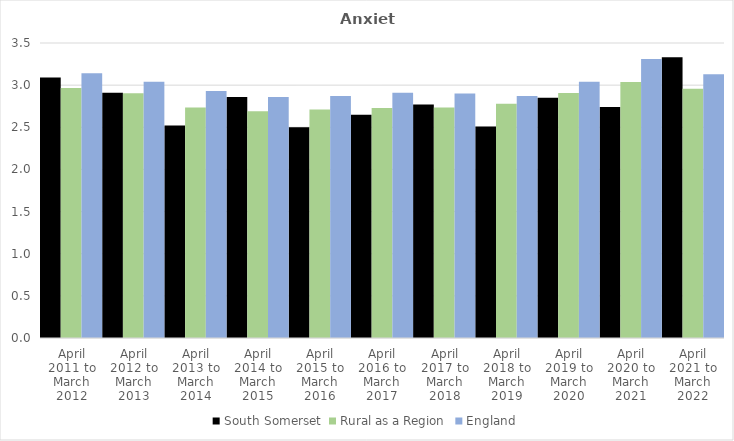
| Category | South Somerset | Rural as a Region | England |
|---|---|---|---|
| April 2011 to March 2012 | 3.09 | 2.967 | 3.14 |
| April 2012 to March 2013 | 2.91 | 2.904 | 3.04 |
| April 2013 to March 2014 | 2.52 | 2.734 | 2.93 |
| April 2014 to March 2015 | 2.86 | 2.691 | 2.86 |
| April 2015 to March 2016 | 2.5 | 2.711 | 2.87 |
| April 2016 to March 2017 | 2.65 | 2.729 | 2.91 |
| April 2017 to March 2018 | 2.77 | 2.736 | 2.9 |
| April 2018 to March 2019 | 2.51 | 2.78 | 2.87 |
| April 2019 to March 2020 | 2.85 | 2.908 | 3.04 |
| April 2020 to March 2021 | 2.74 | 3.036 | 3.31 |
| April 2021 to March 2022 | 3.33 | 2.956 | 3.13 |